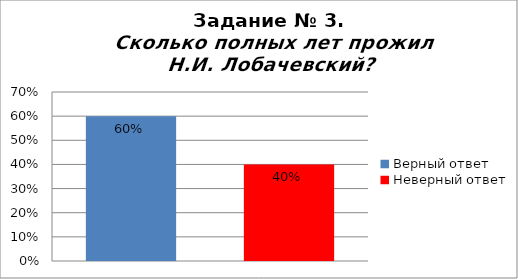
| Category | Сколько полных лет прожил Н.И. Лобачевский? |
|---|---|
| Верный ответ | 0.6 |
| Неверный ответ | 0.4 |